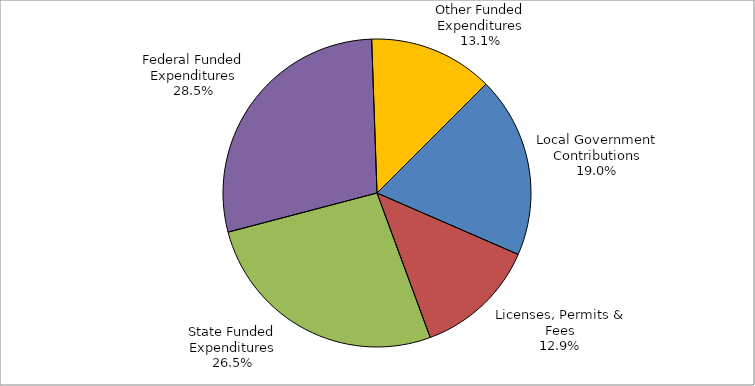
| Category | Series 0 |
|---|---|
| Local Government Contributions | 0.19 |
| Licenses, Permits & Fees | 0.129 |
| State Funded Expenditures | 0.265 |
| Federal Funded Expenditures | 0.285 |
| Other Funded Expenditures | 0.131 |